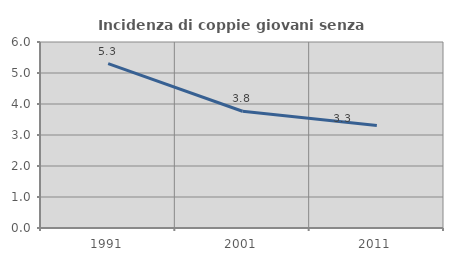
| Category | Incidenza di coppie giovani senza figli |
|---|---|
| 1991.0 | 5.3 |
| 2001.0 | 3.767 |
| 2011.0 | 3.309 |